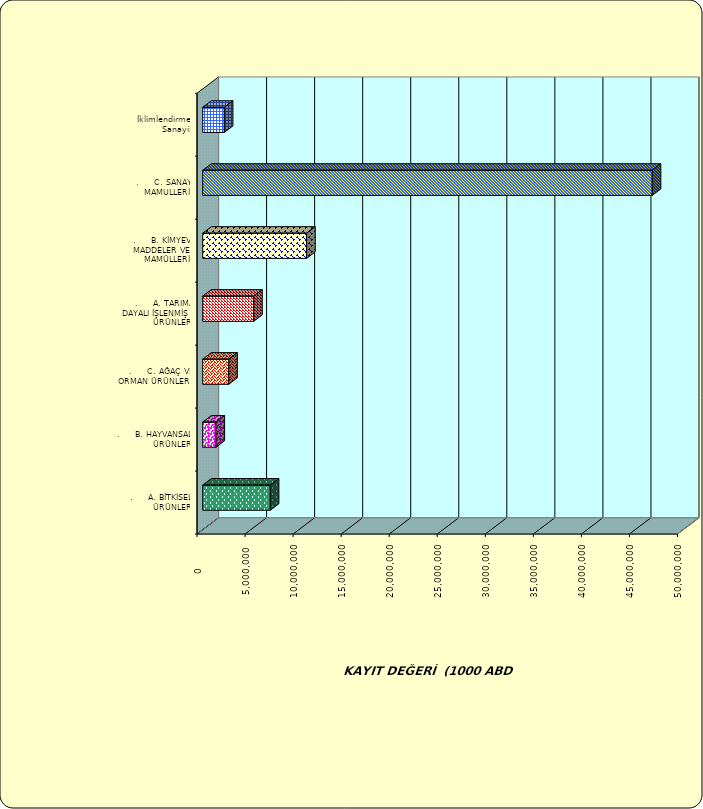
| Category | Series 0 |
|---|---|
| .     A. BİTKİSEL ÜRÜNLER | 7033813.412 |
| .     B. HAYVANSAL ÜRÜNLER | 1382693.071 |
| .     C. AĞAÇ VE ORMAN ÜRÜNLERİ | 2710514.594 |
| .     A. TARIMA DAYALI İŞLENMİŞ ÜRÜNLER | 5305672.793 |
| .     B. KİMYEVİ MADDELER VE MAMÜLLERİ | 10816569.433 |
| .     C. SANAYİ MAMULLERİ | 46780179.05 |
|  İklimlendirme Sanayii | 2249686.265 |